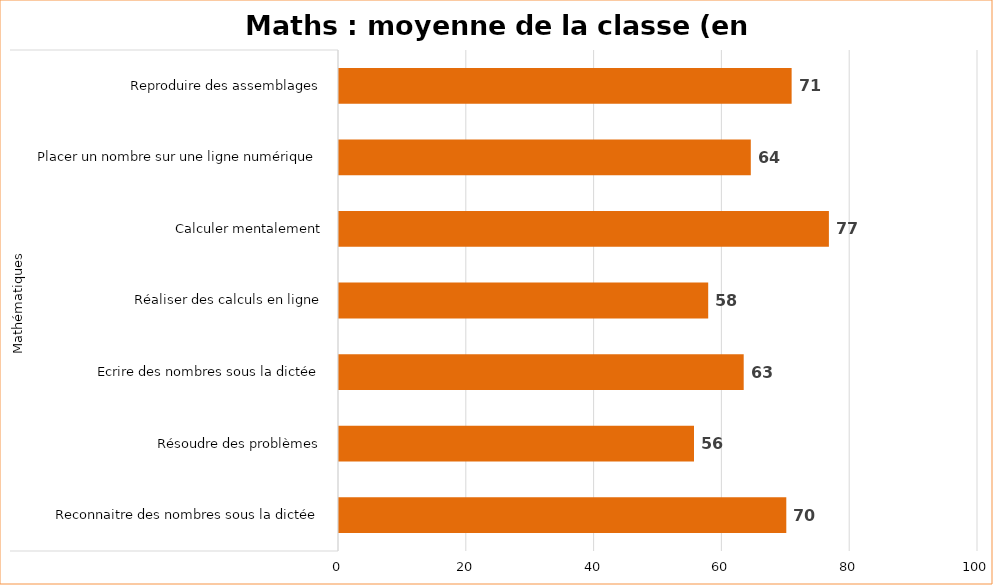
| Category | Series 0 |
|---|---|
| 0 | 70 |
| 1 | 55.556 |
| 2 | 63.333 |
| 3 | 57.778 |
| 4 | 76.667 |
| 5 | 64.444 |
| 6 | 70.833 |